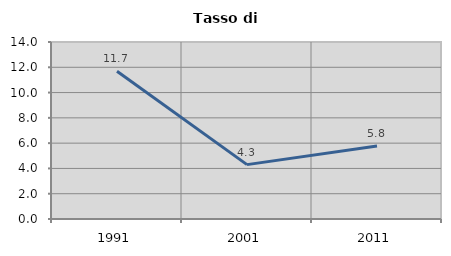
| Category | Tasso di disoccupazione   |
|---|---|
| 1991.0 | 11.683 |
| 2001.0 | 4.3 |
| 2011.0 | 5.774 |